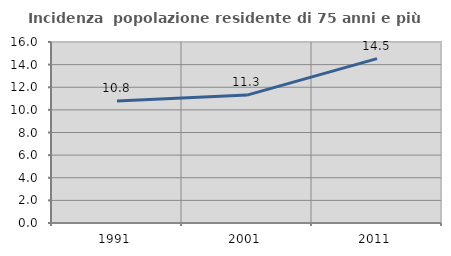
| Category | Incidenza  popolazione residente di 75 anni e più |
|---|---|
| 1991.0 | 10.787 |
| 2001.0 | 11.309 |
| 2011.0 | 14.533 |